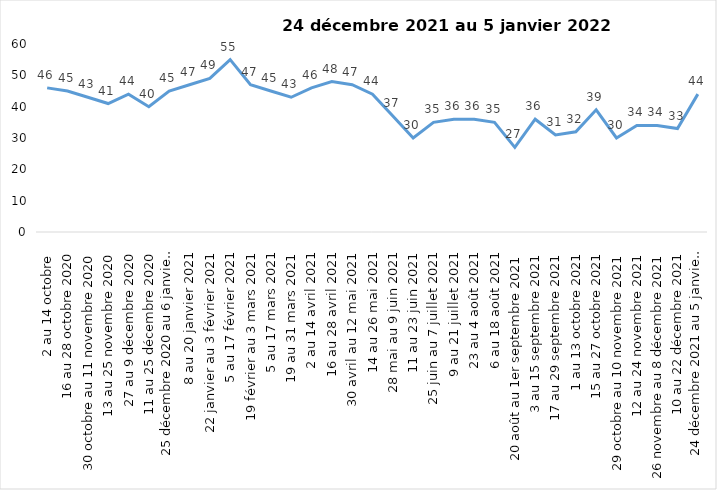
| Category | Toujours aux trois mesures |
|---|---|
| 2 au 14 octobre  | 46 |
| 16 au 28 octobre 2020 | 45 |
| 30 octobre au 11 novembre 2020 | 43 |
| 13 au 25 novembre 2020 | 41 |
| 27 au 9 décembre 2020 | 44 |
| 11 au 25 décembre 2020 | 40 |
| 25 décembre 2020 au 6 janvier 2021 | 45 |
| 8 au 20 janvier 2021 | 47 |
| 22 janvier au 3 février 2021 | 49 |
| 5 au 17 février 2021 | 55 |
| 19 février au 3 mars 2021 | 47 |
| 5 au 17 mars 2021 | 45 |
| 19 au 31 mars 2021 | 43 |
| 2 au 14 avril 2021 | 46 |
| 16 au 28 avril 2021 | 48 |
| 30 avril au 12 mai 2021 | 47 |
| 14 au 26 mai 2021 | 44 |
| 28 mai au 9 juin 2021 | 37 |
| 11 au 23 juin 2021 | 30 |
| 25 juin au 7 juillet 2021 | 35 |
| 9 au 21 juillet 2021 | 36 |
| 23 au 4 août 2021 | 36 |
| 6 au 18 août 2021 | 35 |
| 20 août au 1er septembre 2021 | 27 |
| 3 au 15 septembre 2021 | 36 |
| 17 au 29 septembre 2021 | 31 |
| 1 au 13 octobre 2021 | 32 |
| 15 au 27 octobre 2021 | 39 |
| 29 octobre au 10 novembre 2021 | 30 |
| 12 au 24 novembre 2021 | 34 |
| 26 novembre au 8 décembre 2021 | 34 |
| 10 au 22 décembre 2021 | 33 |
| 24 décembre 2021 au 5 janvier 2022 2022 | 44 |